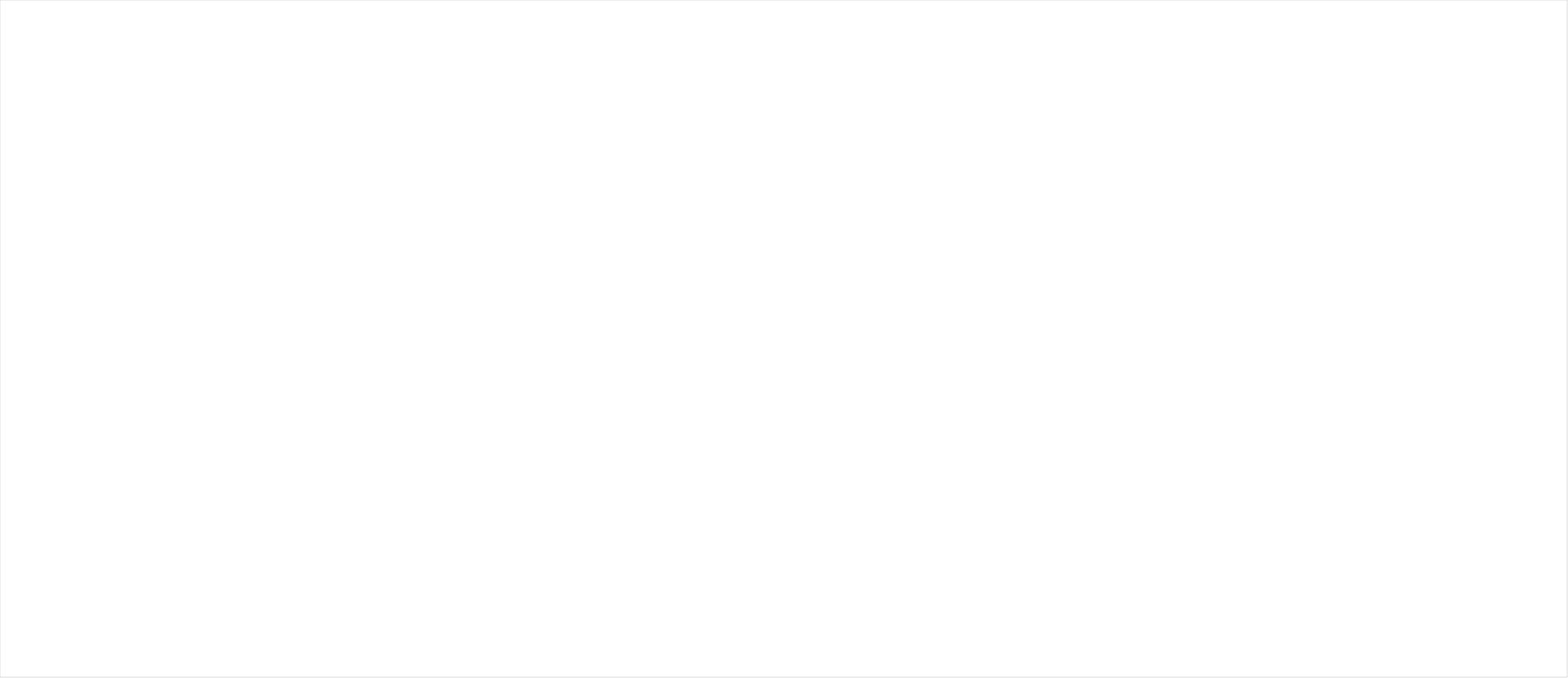
| Category | Series 0 |
|---|---|
| Teachers are proactive in identifying children who could benefit from one-to-one or small-group instrumental or vocal tuition, over and above their classroom experience, regardless of their personal circumstances | 0 |
| Using Pupil Premium funding to subsidise the cost | 0 |
| Incorporating instrumental and vocal tuition into the school day through the timetable | 0 |
| Providing practice spaces | 0 |
| Enabling pupils to come out of lessons in order to take part in instrumental and vocal tuition | 0 |
| Supporting pupils in catching up on missed learning in other subjects  | 0 |
| Considering mitigations to reduce the time missed | 0 |
| Evidencing take-up: numbers, boys/girls  | 0 |
| Evidencing outcomes: progression, drop-out/retention  | 0 |
| Evidencing ‘soft’ outcomes e.g. improved behaviour or academic  | 0 |
| Working with the Music Hub to identify appropriate provision or other options for support, such as instrument loans or weekend, after-school or holiday provision like Saturday music centres and helping with instrument storage | 0 |
| Have at least one vocal ensemble. What choirs are offered (include any staff/parent choirs)  | 0 |
| Have at least one instrumental/music technology-based ensemble. This could include an orchestra but needn’t be restricted only to these types of groups | 0 |
| Children are encouraged to participate  | 0 |
| Performance opportunities offered in-school and out | 0 |
| Performance opportunities are assessed by the school and developed | 0 |
| Considering local community, and the interests and needs of pupils | 0 |
| Reflect on how to complement the school’s curriculum provision  | 0 |
| Reflect on how to complement local out-of-school opportunities | 0 |
| Mindful of when and where such activities should take place to support broad pupil engagement. For example, running a choir over lunchtime could avoid clashes with after-school sport activities or complications with family arrangements | 0 |
| School leaders consider carefully how to support music teaching staff providing such activities outside usual teaching hours, just as they would for other areas such as sport or drama | 0 |